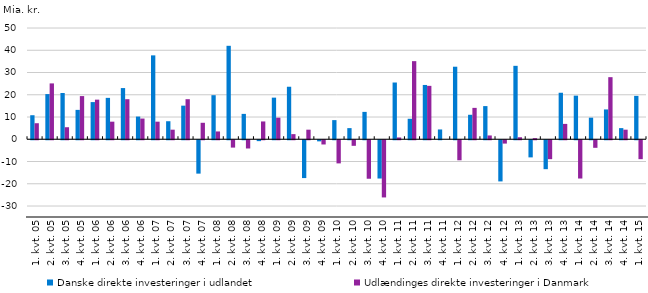
| Category | Danske direkte investeringer i udlandet | Udlændinges direkte investeringer i Danmark |
|---|---|---|
| 1. kvt. 05 | 10.8 | 7.2 |
| 2. kvt. 05 | 20.3 | 25.1 |
| 3. kvt. 05 | 20.8 | 5.4 |
| 4. kvt. 05 | 13.2 | 19.4 |
| 1. kvt. 06 | 16.7 | 17.8 |
| 2. kvt. 06 | 18.6 | 7.9 |
| 3. kvt. 06 | 23 | 18 |
| 4. kvt. 06 | 10.2 | 9.3 |
| 1. kvt. 07 | 37.7 | 7.9 |
| 2. kvt. 07 | 8.1 | 4.3 |
| 3. kvt. 07 | 15.1 | 18 |
| 4. kvt. 07 | -15 | 7.4 |
| 1. kvt. 08 | 19.8 | 3.5 |
| 2. kvt. 08 | 42 | -3.3 |
| 3. kvt. 08 | 11.4 | -3.7 |
| 4. kvt. 08 | -0.4 | 8 |
| 1. kvt. 09 | 18.7 | 9.7 |
| 2. kvt. 09 | 23.6 | 2.3 |
| 3. kvt. 09 | -17 | 4.3 |
| 4. kvt. 09 | -0.5 | -1.9 |
| 1. kvt. 10 | 8.6 | -10.4 |
| 2. kvt. 10 | 5 | -2.5 |
| 3. kvt. 10 | 12.3 | -17.3 |
| 4. kvt. 10 | -17.2 | -25.7 |
| 1. kvt. 11 | 25.5 | 0.8 |
| 2. kvt. 11 | 9.2 | 35.1 |
| 3. kvt. 11 | 24.4 | 24 |
| 4. kvt. 11 | 4.4 | 0 |
| 1. kvt. 12 | 32.6 | -9 |
| 2. kvt. 12 | 11 | 14.1 |
| 3. kvt. 12 | 14.9 | 1.7 |
| 4. kvt. 12 | -18.5 | -1.5 |
| 1. kvt. 13 | 33 | 0.9 |
| 2. kvt. 13 | -7.7 | 0.5 |
| 3. kvt. 13 | -13 | -8.5 |
| 4. kvt. 13 | 20.9 | 6.9 |
| 1. kvt. 14 | 19.6 | -17.2 |
| 2. kvt. 14 | 9.7 | -3.4 |
| 3. kvt. 14 | 13.4 | 27.9 |
| 4. kvt. 14 | 5 | 4.3 |
| 1. kvt. 15 | 19.5 | -8.5 |